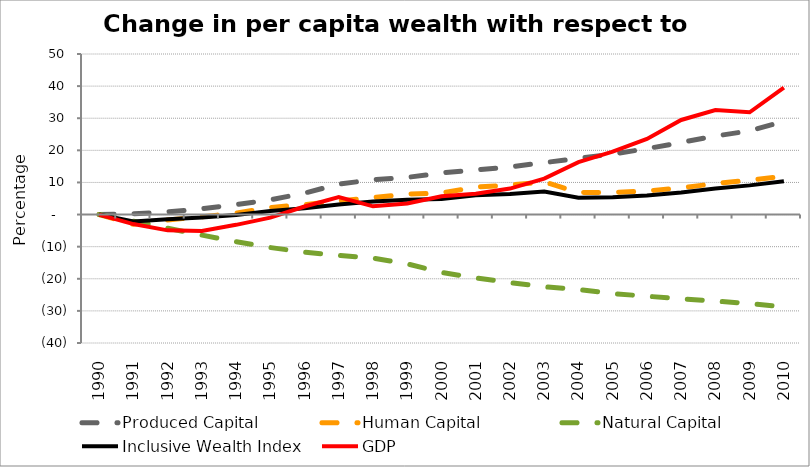
| Category | Produced Capital  | Human Capital | Natural Capital | Inclusive Wealth Index | GDP |
|---|---|---|---|---|---|
| 1990.0 | 0 | 0 | 0 | 0 | 0 |
| 1991.0 | 0.253 | -3.038 | -2.08 | -2.165 | -2.969 |
| 1992.0 | 0.809 | -1.699 | -4.277 | -1.475 | -4.918 |
| 1993.0 | 1.803 | -0.7 | -6.402 | -0.893 | -5.128 |
| 1994.0 | 3.131 | 0.466 | -8.449 | -0.119 | -3.203 |
| 1995.0 | 4.572 | 2.203 | -10.266 | 1.077 | -0.945 |
| 1996.0 | 6.682 | 3.103 | -11.727 | 1.937 | 2.513 |
| 1997.0 | 9.454 | 4.199 | -12.689 | 3.138 | 5.453 |
| 1998.0 | 10.863 | 5.307 | -13.567 | 4.049 | 2.56 |
| 1999.0 | 11.575 | 6.351 | -15.364 | 4.639 | 3.445 |
| 2000.0 | 12.953 | 6.698 | -18.035 | 4.817 | 5.716 |
| 2001.0 | 13.886 | 8.537 | -19.715 | 5.982 | 6.497 |
| 2002.0 | 14.859 | 9.168 | -21.188 | 6.409 | 8.099 |
| 2003.0 | 16.172 | 10.194 | -22.503 | 7.188 | 11.178 |
| 2004.0 | 17.493 | 6.826 | -23.338 | 5.221 | 16.302 |
| 2005.0 | 18.856 | 6.87 | -24.621 | 5.387 | 19.566 |
| 2006.0 | 20.516 | 7.346 | -25.435 | 5.959 | 23.567 |
| 2007.0 | 22.451 | 8.293 | -26.218 | 6.899 | 29.46 |
| 2008.0 | 24.455 | 9.652 | -26.957 | 8.125 | 32.563 |
| 2009.0 | 26.066 | 10.746 | -27.718 | 9.089 | 31.848 |
| 2010.0 | 29.05 | 11.871 | -28.773 | 10.344 | 39.54 |